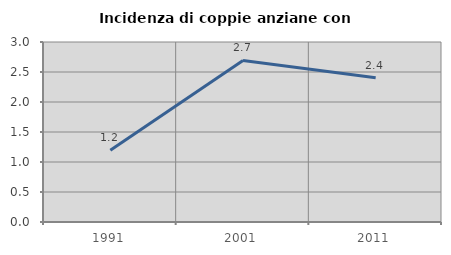
| Category | Incidenza di coppie anziane con figli |
|---|---|
| 1991.0 | 1.198 |
| 2001.0 | 2.693 |
| 2011.0 | 2.405 |